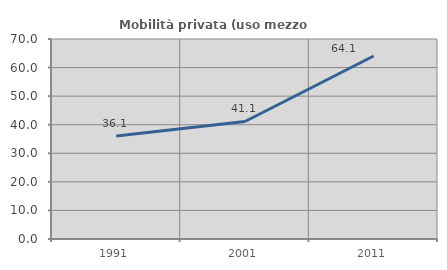
| Category | Mobilità privata (uso mezzo privato) |
|---|---|
| 1991.0 | 36.061 |
| 2001.0 | 41.134 |
| 2011.0 | 64.053 |